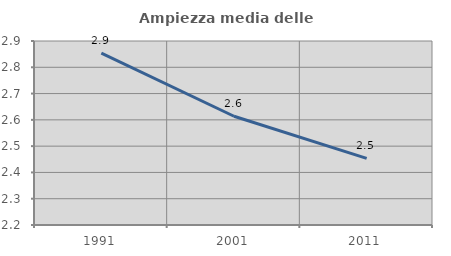
| Category | Ampiezza media delle famiglie |
|---|---|
| 1991.0 | 2.854 |
| 2001.0 | 2.614 |
| 2011.0 | 2.454 |